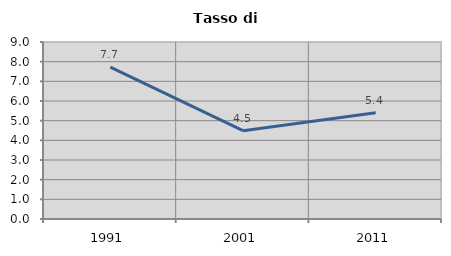
| Category | Tasso di disoccupazione   |
|---|---|
| 1991.0 | 7.725 |
| 2001.0 | 4.492 |
| 2011.0 | 5.4 |